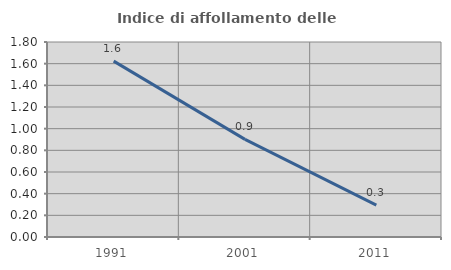
| Category | Indice di affollamento delle abitazioni  |
|---|---|
| 1991.0 | 1.623 |
| 2001.0 | 0.901 |
| 2011.0 | 0.295 |